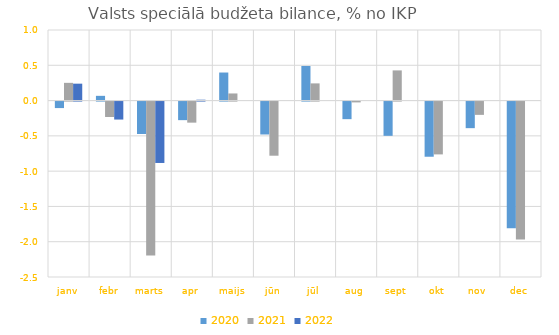
| Category | 2020 | 2021 | 2022 |
|---|---|---|---|
| janv | -0.092 | 0.251 | 0.24 |
| febr | 0.067 | -0.218 | -0.255 |
| marts | -0.46 | -2.183 | -0.87 |
| apr | -0.263 | -0.299 | 0.012 |
| maijs | 0.397 | 0.101 | 0 |
| jūn | -0.466 | -0.767 | 0 |
| jūl | 0.49 | 0.243 | 0 |
| aug | -0.249 | -0.012 | 0 |
| sept | -0.485 | 0.427 | 0 |
| okt | -0.782 | -0.749 | 0 |
| nov | -0.377 | -0.188 | 0 |
| dec | -1.793 | -1.955 | 0 |